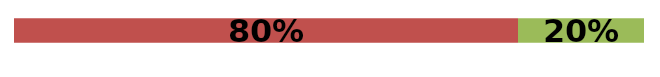
| Category | Series 0 | Series 1 | Series 2 |
|---|---|---|---|
| 0 | 0 | 0.8 | 0.2 |